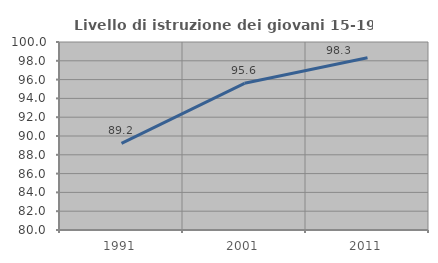
| Category | Livello di istruzione dei giovani 15-19 anni |
|---|---|
| 1991.0 | 89.216 |
| 2001.0 | 95.604 |
| 2011.0 | 98.333 |